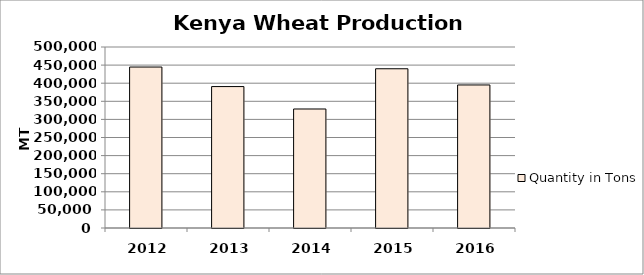
| Category | Quantity in Tons |
|---|---|
| 2012.0 | 444642.57 |
| 2013.0 | 390692.43 |
| 2014.0 | 328746.75 |
| 2015.0 | 439889 |
| 2016.0 | 395135.2 |